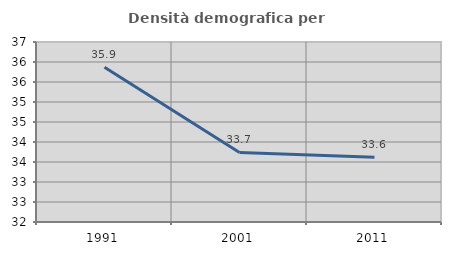
| Category | Densità demografica |
|---|---|
| 1991.0 | 35.87 |
| 2001.0 | 33.739 |
| 2011.0 | 33.621 |